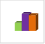
| Category | област Кърджали |
|---|---|
| летен сезон 2019  | 32717 |
| летен сезон 2021  | 68652 |
| летен сезон 2022 г.  | 63182 |